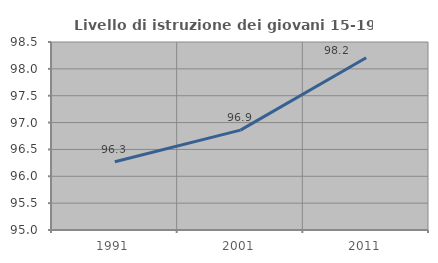
| Category | Livello di istruzione dei giovani 15-19 anni |
|---|---|
| 1991.0 | 96.271 |
| 2001.0 | 96.859 |
| 2011.0 | 98.206 |